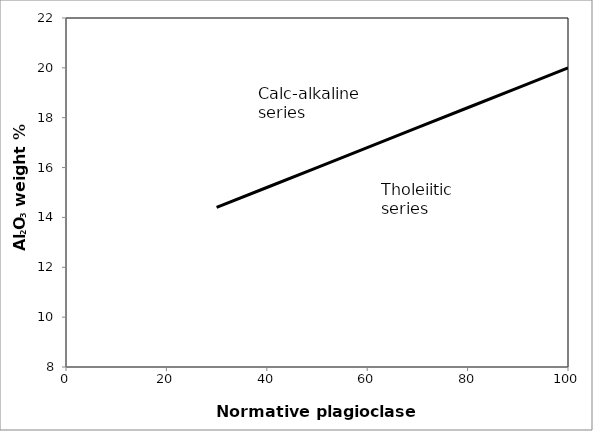
| Category | Series 0 |
|---|---|
| 30.0 | 14.4 |
| 40.0 | 15.2 |
| 50.0 | 16 |
| 60.0 | 16.8 |
| 70.0 | 17.6 |
| 80.0 | 18.4 |
| 90.0 | 19.2 |
| 100.0 | 20 |